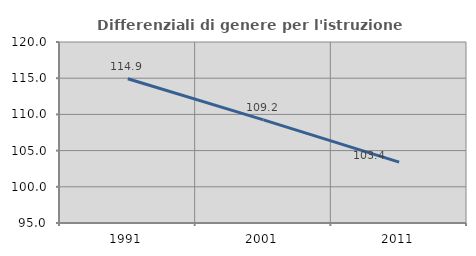
| Category | Differenziali di genere per l'istruzione superiore |
|---|---|
| 1991.0 | 114.921 |
| 2001.0 | 109.236 |
| 2011.0 | 103.4 |